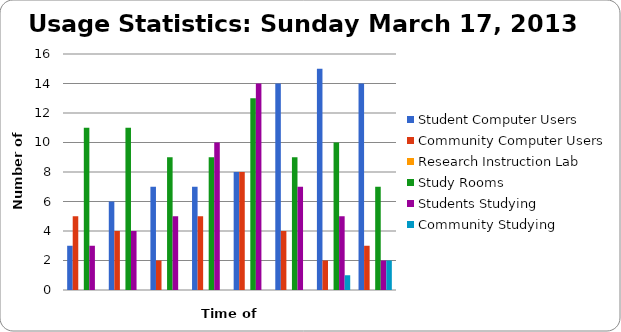
| Category | Student Computer Users | Community Computer Users | Research Instruction Lab | Study Rooms | Students Studying | Community Studying |
|---|---|---|---|---|---|---|
| 10 am | 3 | 5 | 0 | 11 | 3 | 0 |
| 11 am | 6 | 4 | 0 | 11 | 4 | 0 |
| 12 pm | 7 | 2 | 0 | 9 | 5 | 0 |
| 1 pm | 7 | 5 | 0 | 9 | 10 | 0 |
| 2 pm | 8 | 8 | 0 | 13 | 14 | 0 |
| 3 pm | 14 | 4 | 0 | 9 | 7 | 0 |
| 4 pm | 15 | 2 | 0 | 10 | 5 | 1 |
| 5 pm | 14 | 3 | 0 | 7 | 2 | 2 |